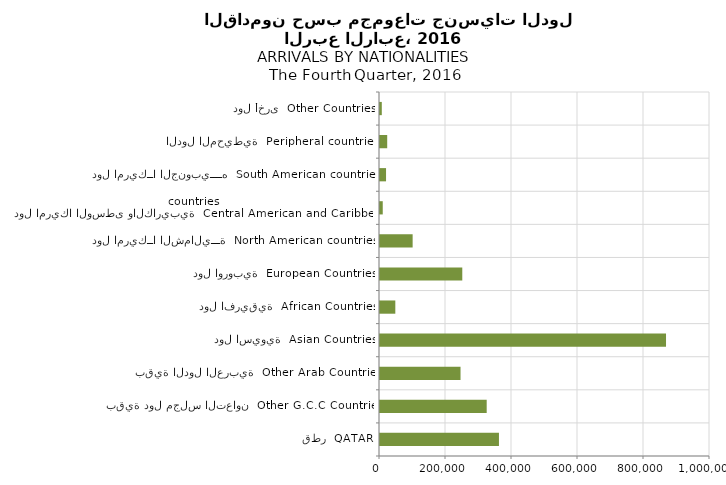
| Category | Series 0 |
|---|---|
| قطر  QATAR | 360482 |
| بقية دول مجلس التعاون  Other G.C.C Countries | 323310 |
| بقية الدول العربية  Other Arab Countries | 244024 |
| دول اسيوية  Asian Countries | 866723 |
| دول افريقية  African Countries | 46418 |
| دول اوروبية  European Countries | 249348 |
| دول امريكــا الشماليـــة  North American countries  | 98909 |
| دول امريكا الوسطى والكاريبية  Central American and Caribbean countries | 8330 |
| دول امريكــا الجنوبيــــه  South American countries | 18318 |
| الدول المحيطية  Peripheral countries | 21832 |
| دول أخرى  Other Countries | 5438 |